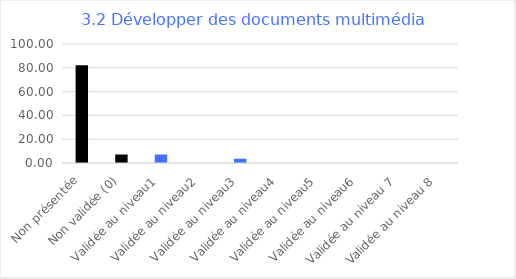
| Category | Series 0 |
|---|---|
| Non présentée | 82.143 |
| Non validée (0) | 7.143 |
| Validée au niveau1 | 7.143 |
| Validée au niveau2 | 0 |
| Validée au niveau3 | 3.571 |
| Validée au niveau4 | 0 |
| Validée au niveau5 | 0 |
| Validée au niveau6 | 0 |
| Validée au niveau 7 | 0 |
| Validée au niveau 8 | 0 |